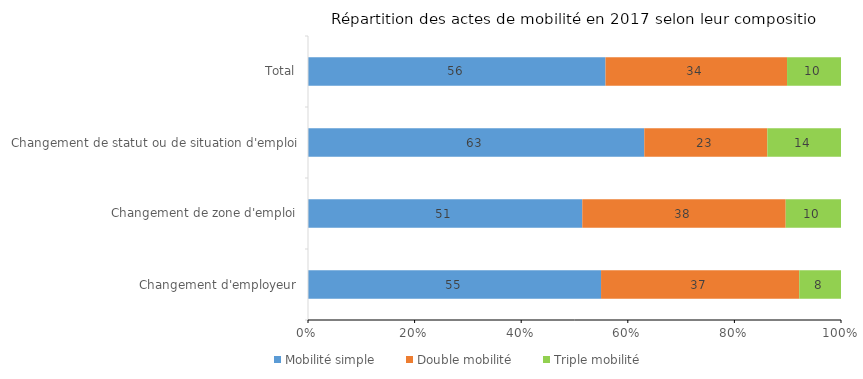
| Category | Mobilité simple | Double mobilité | Triple mobilité |
|---|---|---|---|
| Changement d'employeur | 54.982 | 37.182 | 7.836 |
| Changement de zone d'emploi | 51.463 | 38.163 | 10.374 |
| Changement de statut ou de situation d'emploi | 63.093 | 23.09 | 13.817 |
| Total | 55.818 | 34.06 | 10.122 |